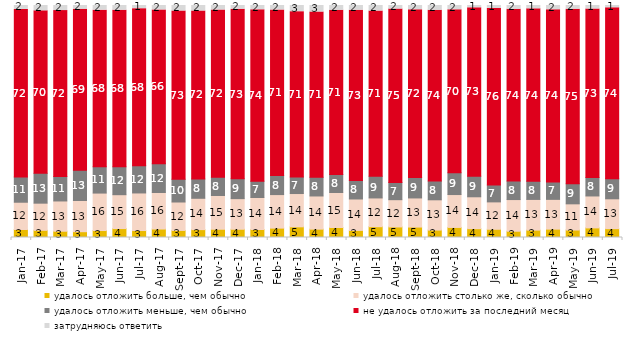
| Category | удалось отложить больше, чем обычно | удалось отложить столько же, сколько обычно | удалось отложить меньше, чем обычно | не удалось отложить за последний месяц | затрудняюсь ответить |
|---|---|---|---|---|---|
| 2017-01-01 | 3.45 | 11.75 | 10.9 | 72.2 | 1.7 |
| 2017-02-01 | 3.1 | 11.7 | 12.85 | 70.05 | 2.3 |
| 2017-03-01 | 2.7 | 13.05 | 10.55 | 71.5 | 2.2 |
| 2017-04-01 | 2.5 | 13.45 | 13 | 69.4 | 1.6 |
| 2017-05-01 | 3 | 16.15 | 11.35 | 67.5 | 2 |
| 2017-06-01 | 3.85 | 14.6 | 12 | 67.5 | 2.05 |
| 2017-07-01 | 3 | 16.2 | 11.75 | 67.7 | 1.35 |
| 2017-08-01 | 3.65 | 15.75 | 12.4 | 66.3 | 1.9 |
| 2017-09-01 | 3.05 | 12.25 | 9.8 | 72.55 | 2.35 |
| 2017-10-01 | 3.4 | 13.5 | 8.3 | 72.45 | 2.35 |
| 2017-11-01 | 3.55 | 14.55 | 7.85 | 72.05 | 1.95 |
| 2017-12-01 | 3.55 | 13.2 | 8.55 | 73.1 | 1.6 |
| 2018-01-01 | 3.45 | 13.8 | 7 | 73.9 | 1.85 |
| 2018-02-01 | 4.05 | 14.45 | 8.25 | 71.3 | 1.95 |
| 2018-03-01 | 4.6 | 14.35 | 7.1 | 71.3 | 2.65 |
| 2018-04-01 | 3.6 | 14.3 | 8.05 | 71.25 | 2.8 |
| 2018-05-01 | 4.3 | 15.1 | 7.75 | 70.75 | 2.1 |
| 2018-06-01 | 3.05 | 13.55 | 7.95 | 73.4 | 2.05 |
| 2018-07-01 | 4.65 | 12.4 | 9.35 | 71.2 | 2.4 |
| 2018-08-01 | 4.55 | 11.75 | 7.45 | 74.7 | 1.55 |
| 2018-09-01 | 4.5 | 12.55 | 8.8 | 72.3 | 1.85 |
| 2018-10-01 | 3.2 | 13.05 | 8.05 | 73.6 | 2.1 |
| 2018-11-01 | 4.341 | 14.172 | 9.381 | 70.259 | 1.846 |
| 2018-12-01 | 3.8 | 13.75 | 8.9 | 72.55 | 1 |
| 2019-01-01 | 3.55 | 11.8 | 7.25 | 76.1 | 1.3 |
| 2019-02-01 | 2.7 | 13.65 | 7.95 | 74.05 | 1.65 |
| 2019-03-01 | 3.182 | 13.227 | 7.857 | 74.291 | 1.442 |
| 2019-04-01 | 3.614 | 12.822 | 7.475 | 74.257 | 1.832 |
| 2019-05-01 | 3.219 | 11.293 | 8.618 | 75.285 | 1.585 |
| 2019-06-01 | 4.14 | 13.766 | 7.93 | 72.668 | 1.496 |
| 2019-07-01 | 3.812 | 12.871 | 8.663 | 73.663 | 0.99 |